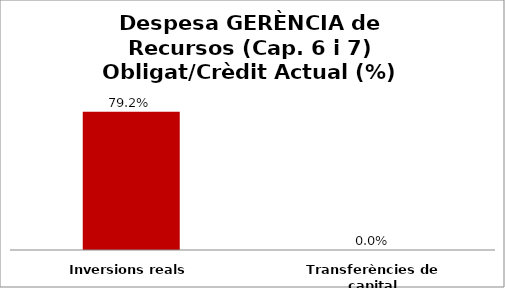
| Category | Series 0 |
|---|---|
| Inversions reals | 0.792 |
| Transferències de capital | 0 |